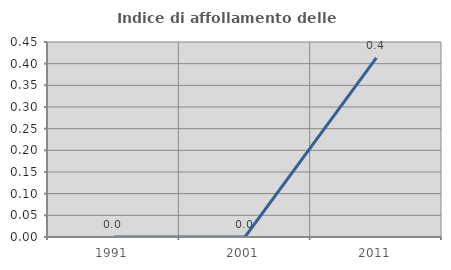
| Category | Indice di affollamento delle abitazioni  |
|---|---|
| 1991.0 | 0 |
| 2001.0 | 0 |
| 2011.0 | 0.413 |